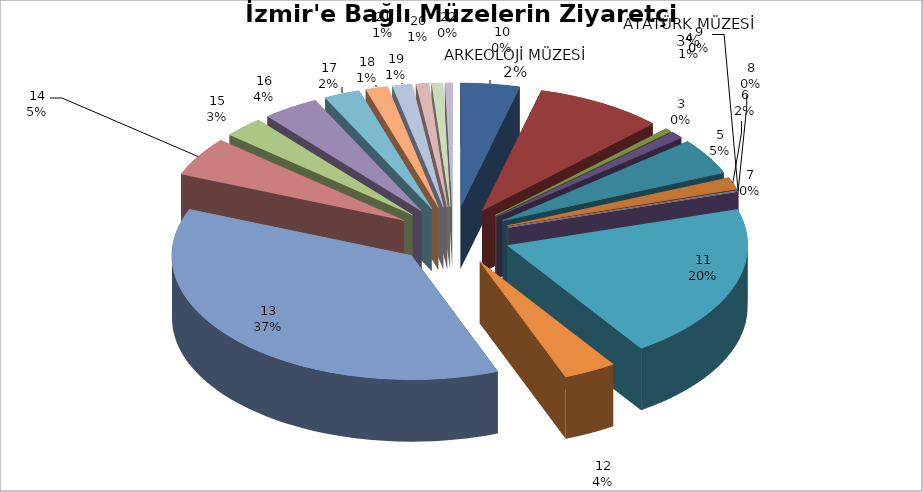
| Category | Series 0 |
|---|---|
| 0 | 7586 |
| 1 | 16481 |
| 2 | 915 |
| 3 | 1708 |
| 4 | 8918 |
| 5 | 2953 |
| 6 | 230 |
| 7 | 0 |
| 8 | 0 |
| 9 | 0 |
| 10 | 38791 |
| 11 | 6799 |
| 12 | 70532 |
| 13 | 9750 |
| 14 | 5146 |
| 15 | 7241 |
| 16 | 4625 |
| 17 | 2825 |
| 18 | 2533 |
| 19 | 1625 |
| 20 | 1410 |
| 21 | 940 |